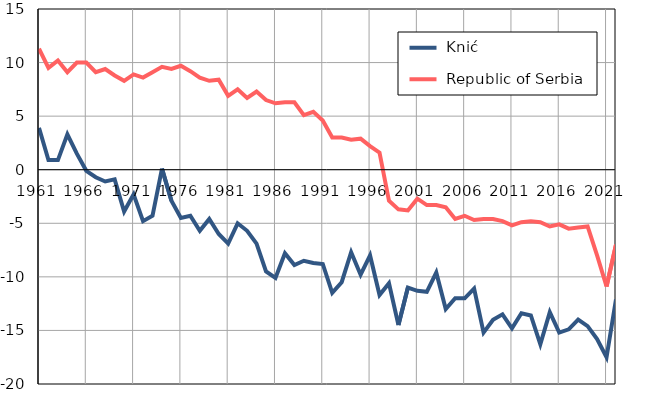
| Category |  Knić |  Republic of Serbia |
|---|---|---|
| 1961.0 | 3.9 | 11.3 |
| 1962.0 | 0.9 | 9.5 |
| 1963.0 | 0.9 | 10.2 |
| 1964.0 | 3.3 | 9.1 |
| 1965.0 | 1.5 | 10 |
| 1966.0 | -0.1 | 10 |
| 1967.0 | -0.7 | 9.1 |
| 1968.0 | -1.1 | 9.4 |
| 1969.0 | -0.9 | 8.8 |
| 1970.0 | -3.9 | 8.3 |
| 1971.0 | -2.3 | 8.9 |
| 1972.0 | -4.8 | 8.6 |
| 1973.0 | -4.3 | 9.1 |
| 1974.0 | 0.1 | 9.6 |
| 1975.0 | -2.9 | 9.4 |
| 1976.0 | -4.5 | 9.7 |
| 1977.0 | -4.3 | 9.2 |
| 1978.0 | -5.7 | 8.6 |
| 1979.0 | -4.6 | 8.3 |
| 1980.0 | -6 | 8.4 |
| 1981.0 | -6.9 | 6.9 |
| 1982.0 | -5 | 7.5 |
| 1983.0 | -5.7 | 6.7 |
| 1984.0 | -6.9 | 7.3 |
| 1985.0 | -9.5 | 6.5 |
| 1986.0 | -10.1 | 6.2 |
| 1987.0 | -7.8 | 6.3 |
| 1988.0 | -8.9 | 6.3 |
| 1989.0 | -8.5 | 5.1 |
| 1990.0 | -8.7 | 5.4 |
| 1991.0 | -8.8 | 4.6 |
| 1992.0 | -11.5 | 3 |
| 1993.0 | -10.5 | 3 |
| 1994.0 | -7.7 | 2.8 |
| 1995.0 | -9.8 | 2.9 |
| 1996.0 | -8 | 2.2 |
| 1997.0 | -11.7 | 1.6 |
| 1998.0 | -10.6 | -2.9 |
| 1999.0 | -14.5 | -3.7 |
| 2000.0 | -11 | -3.8 |
| 2001.0 | -11.3 | -2.7 |
| 2002.0 | -11.4 | -3.3 |
| 2003.0 | -9.6 | -3.3 |
| 2004.0 | -13 | -3.5 |
| 2005.0 | -12 | -4.6 |
| 2006.0 | -12 | -4.3 |
| 2007.0 | -11.1 | -4.7 |
| 2008.0 | -15.2 | -4.6 |
| 2009.0 | -14 | -4.6 |
| 2010.0 | -13.5 | -4.8 |
| 2011.0 | -14.8 | -5.2 |
| 2012.0 | -13.4 | -4.9 |
| 2013.0 | -13.6 | -4.8 |
| 2014.0 | -16.3 | -4.9 |
| 2015.0 | -13.3 | -5.3 |
| 2016.0 | -15.2 | -5.1 |
| 2017.0 | -14.9 | -5.5 |
| 2018.0 | -14 | -5.4 |
| 2019.0 | -14.6 | -5.3 |
| 2020.0 | -15.8 | -8 |
| 2021.0 | -17.5 | -10.9 |
| 2022.0 | -12.1 | -7 |